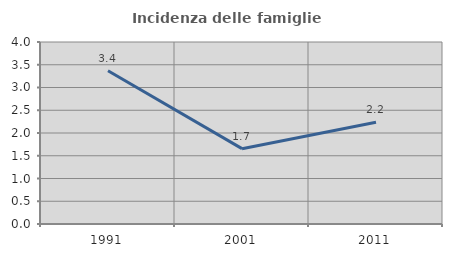
| Category | Incidenza delle famiglie numerose |
|---|---|
| 1991.0 | 3.369 |
| 2001.0 | 1.656 |
| 2011.0 | 2.235 |